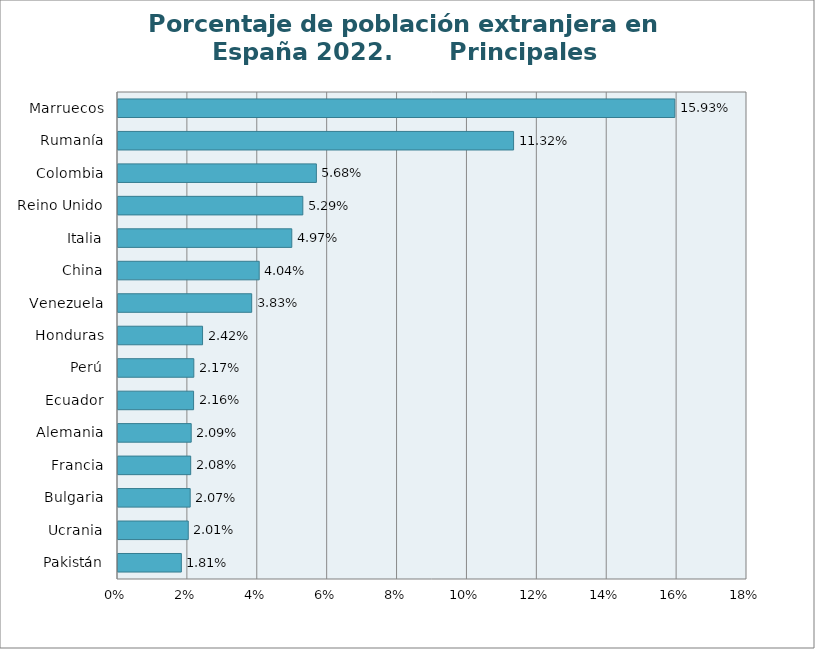
| Category | Series 0 |
|---|---|
| Pakistán | 0.018 |
| Ucrania | 0.02 |
| Bulgaria | 0.021 |
| Francia | 0.021 |
| Alemania | 0.021 |
| Ecuador | 0.022 |
| Perú | 0.022 |
| Honduras | 0.024 |
| Venezuela | 0.038 |
| China | 0.04 |
| Italia | 0.05 |
| Reino Unido | 0.053 |
| Colombia | 0.057 |
| Rumanía | 0.113 |
| Marruecos | 0.159 |